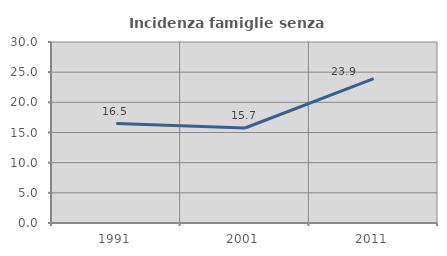
| Category | Incidenza famiglie senza nuclei |
|---|---|
| 1991.0 | 16.484 |
| 2001.0 | 15.743 |
| 2011.0 | 23.941 |